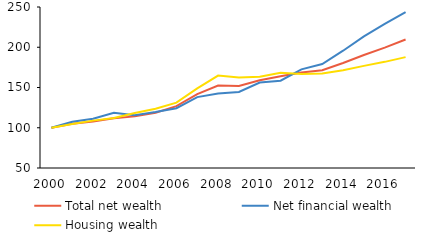
| Category | Total net wealth | Net financial wealth | Housing wealth |
|---|---|---|---|
| 2000 | 100 | 100 | 100 |
| 2001 | 104.847 | 107.361 | 104.696 |
| 2002 | 107.721 | 111.126 | 108.852 |
| 2003 | 111.788 | 118.596 | 112.22 |
| 2004 | 114.134 | 115.544 | 118.24 |
| 2005 | 118.723 | 119.522 | 123.62 |
| 2006 | 126.88 | 124.27 | 131.203 |
| 2007 | 141.75 | 138.045 | 148.965 |
| 2008 | 152.398 | 142.417 | 164.814 |
| 2009 | 151.976 | 144.539 | 162.369 |
| 2010 | 159.042 | 156.219 | 163.35 |
| 2011 | 164.084 | 158.408 | 168.191 |
| 2012 | 168.703 | 172.517 | 166.861 |
| 2013 | 171.486 | 179.158 | 167.509 |
| 2014 | 180.448 | 195.704 | 171.366 |
| 2015 | 190.31 | 213.446 | 176.858 |
| 2016 | 199.458 | 228.908 | 181.861 |
| 2017 | 209.648 | 243.704 | 187.72 |